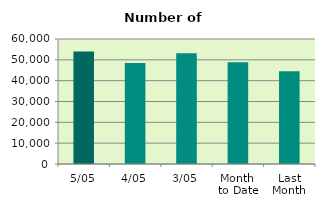
| Category | Series 0 |
|---|---|
| 5/05 | 53978 |
| 4/05 | 48458 |
| 3/05 | 53154 |
| Month 
to Date | 48823.5 |
| Last
Month | 44538 |